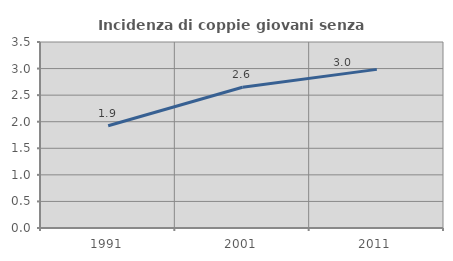
| Category | Incidenza di coppie giovani senza figli |
|---|---|
| 1991.0 | 1.923 |
| 2001.0 | 2.649 |
| 2011.0 | 2.985 |